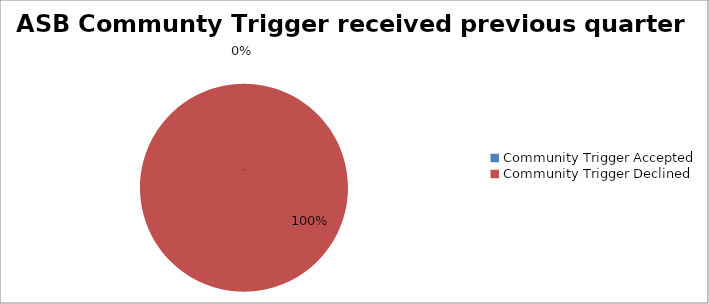
| Category | Series 0 |
|---|---|
| Community Trigger Accepted | 0 |
| Community Trigger Declined | 9 |